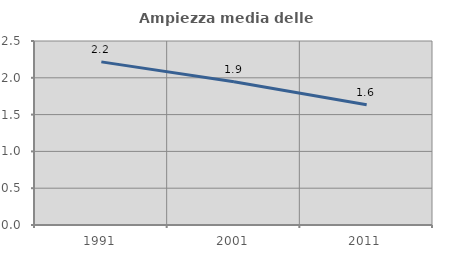
| Category | Ampiezza media delle famiglie |
|---|---|
| 1991.0 | 2.216 |
| 2001.0 | 1.945 |
| 2011.0 | 1.633 |